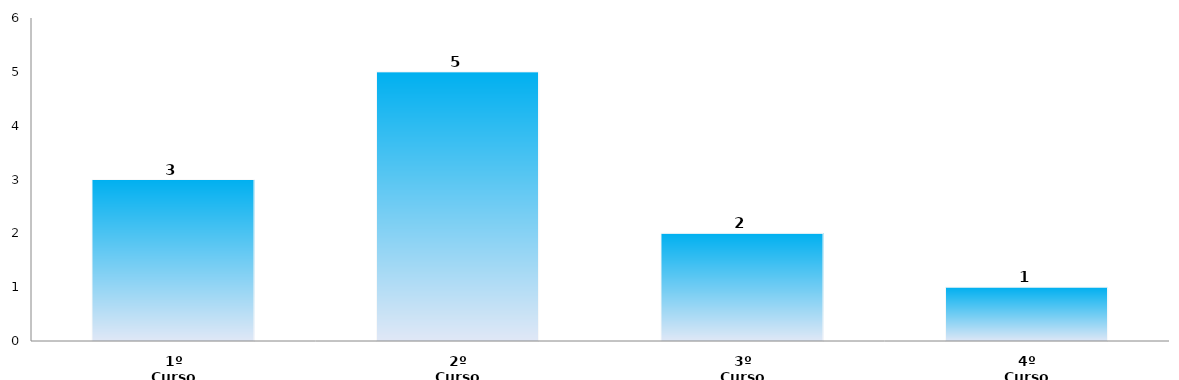
| Category | Series 0 |
|---|---|
| 1º Curso | 3 |
| 2º Curso | 5 |
| 3º Curso | 2 |
| 4º Curso | 1 |